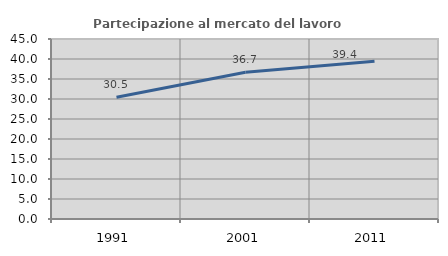
| Category | Partecipazione al mercato del lavoro  femminile |
|---|---|
| 1991.0 | 30.453 |
| 2001.0 | 36.667 |
| 2011.0 | 39.431 |